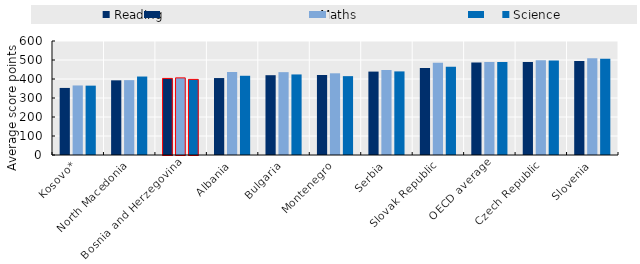
| Category | Reading | Maths | Science |
|---|---|---|---|
| Kosovo* | 353 | 366 | 365 |
| North Macedonia | 393 | 394 | 413 |
| Bosnia and Herzegovina | 403 | 406 | 398 |
| Albania | 405 | 437 | 417 |
| Bulgaria | 420 | 436 | 424 |
| Montenegro | 421 | 430 | 415 |
| Serbia | 439 | 448 | 440 |
| Slovak Republic | 458 | 486 | 464 |
| OECD average | 487 | 489 | 489 |
| Czech Republic | 490 | 499 | 497 |
| Slovenia | 495 | 509 | 507 |